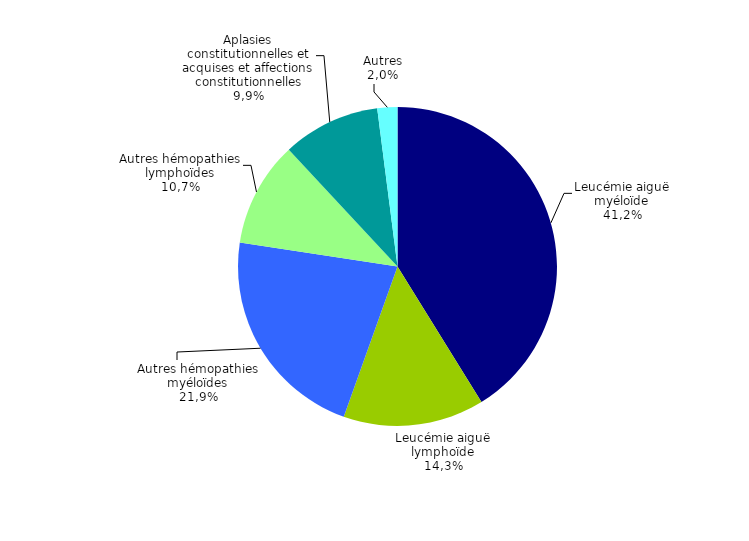
| Category | Nombre |
|---|---|
| Leucémie aiguë myéloïde | 749 |
| Leucémie aiguë lymphoïde | 260 |
| Autres hémopathies myéloïdes | 399 |
| Autres hémopathies lymphoïdes | 194 |
| Aplasies constitutionnelles et acquises et affections constitutionnelles | 180 |
| Autres | 37 |